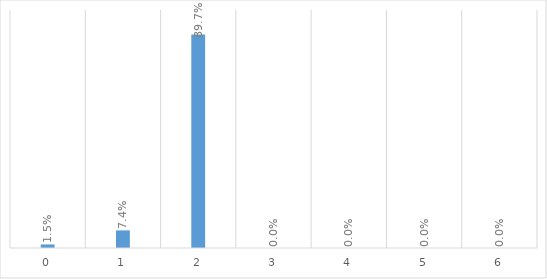
| Category | Series 0 |
|---|---|
| 0.0 | 0.015 |
| 1.0 | 0.074 |
| 2.0 | 0.897 |
| 3.0 | 0 |
| 4.0 | 0 |
| 5.0 | 0 |
| 6.0 | 0 |